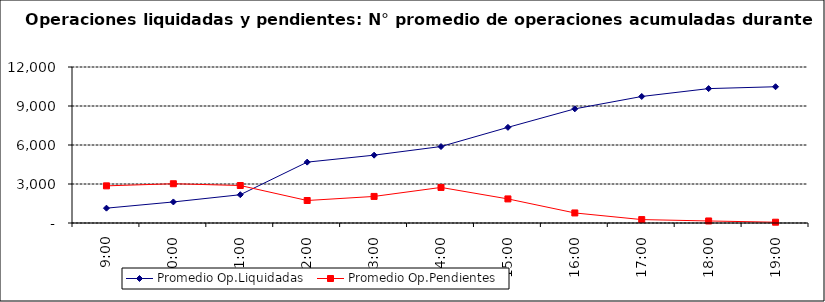
| Category | Promedio Op.Liquidadas | Promedio Op.Pendientes |
|---|---|---|
| 0.375 | 1141.048 | 2857.429 |
| 0.4166666666666667 | 1619.286 | 3019.952 |
| 0.4583333333333333 | 2175.476 | 2883.81 |
| 0.5 | 4681.905 | 1730 |
| 0.5416666666666666 | 5218.333 | 2044.143 |
| 0.5833333333333334 | 5882.571 | 2736.238 |
| 0.625 | 7358.143 | 1852.286 |
| 0.6666666666666666 | 8780.571 | 773.095 |
| 0.7083333333333334 | 9732.714 | 262.905 |
| 0.75 | 10338.333 | 157.381 |
| 0.7916666666666666 | 10481.905 | 61.238 |